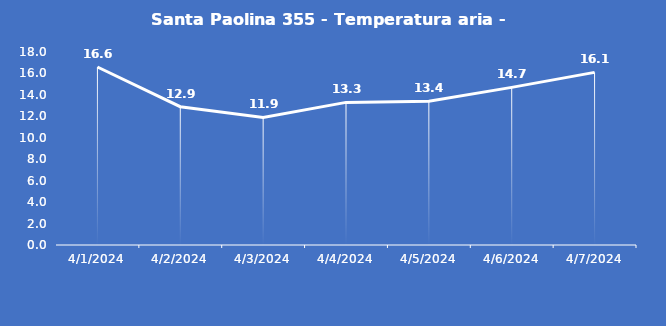
| Category | Santa Paolina 355 - Temperatura aria - Grezzo (°C) |
|---|---|
| 4/1/24 | 16.6 |
| 4/2/24 | 12.9 |
| 4/3/24 | 11.9 |
| 4/4/24 | 13.3 |
| 4/5/24 | 13.4 |
| 4/6/24 | 14.7 |
| 4/7/24 | 16.1 |